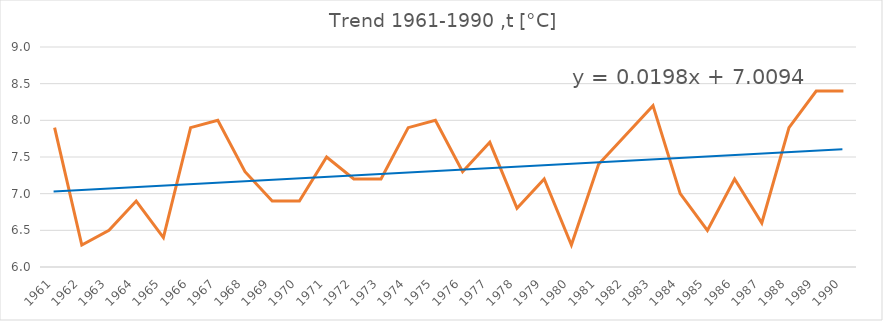
| Category |  t [°C] |
|---|---|
| 1961.0 | 7.9 |
| 1962.0 | 6.3 |
| 1963.0 | 6.5 |
| 1964.0 | 6.9 |
| 1965.0 | 6.4 |
| 1966.0 | 7.9 |
| 1967.0 | 8 |
| 1968.0 | 7.3 |
| 1969.0 | 6.9 |
| 1970.0 | 6.9 |
| 1971.0 | 7.5 |
| 1972.0 | 7.2 |
| 1973.0 | 7.2 |
| 1974.0 | 7.9 |
| 1975.0 | 8 |
| 1976.0 | 7.3 |
| 1977.0 | 7.7 |
| 1978.0 | 6.8 |
| 1979.0 | 7.2 |
| 1980.0 | 6.3 |
| 1981.0 | 7.4 |
| 1982.0 | 7.8 |
| 1983.0 | 8.2 |
| 1984.0 | 7 |
| 1985.0 | 6.5 |
| 1986.0 | 7.2 |
| 1987.0 | 6.6 |
| 1988.0 | 7.9 |
| 1989.0 | 8.4 |
| 1990.0 | 8.4 |